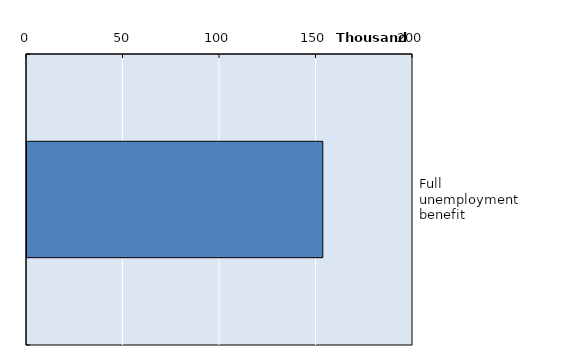
| Category | Series 0 |
|---|---|
| Full unemployment benefit | 153268 |